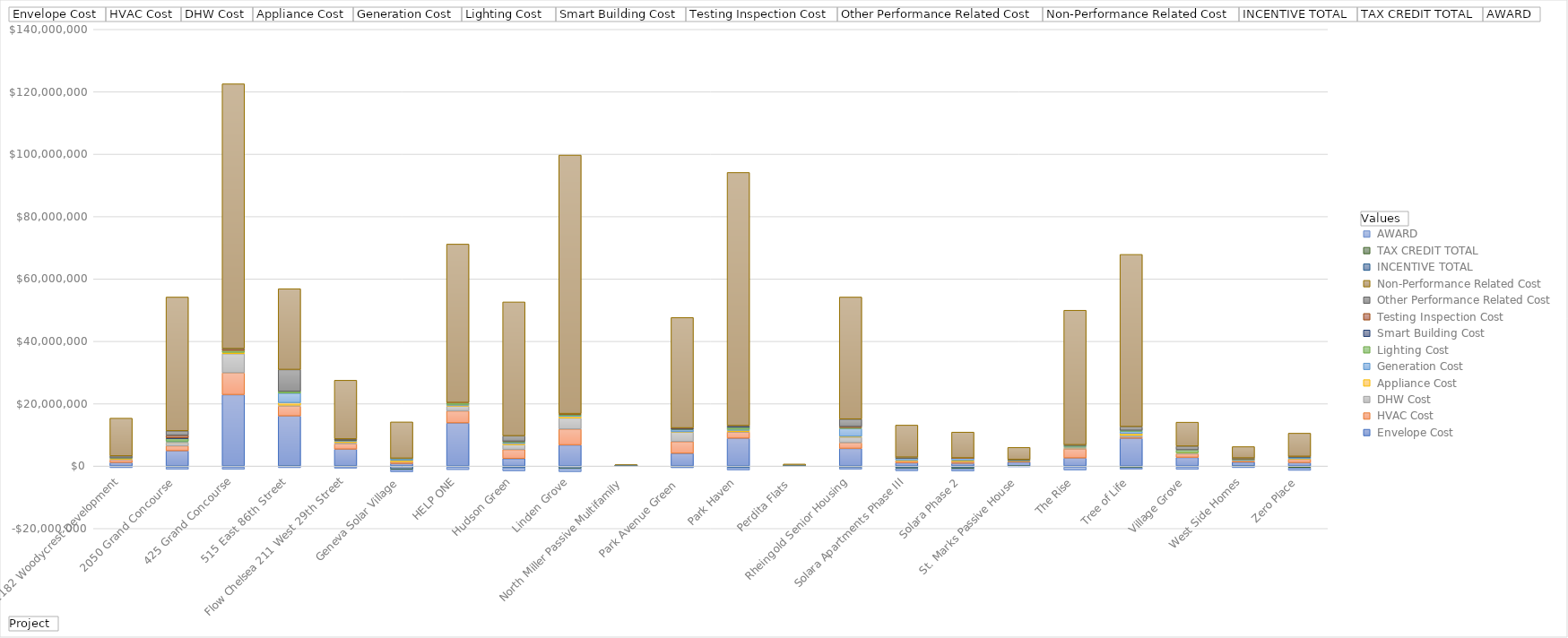
| Category |  Envelope Cost |  HVAC Cost |  DHW Cost |  Appliance Cost |  Generation Cost |  Lighting Cost  |  Smart Building Cost |  Testing Inspection Cost |  Other Performance Related Cost |  Non-Performance Related Cost |  INCENTIVE TOTAL |  TAX CREDIT TOTAL |  AWARD |
|---|---|---|---|---|---|---|---|---|---|---|---|---|---|
| 1182 Woodycrest Development | 1130801.59 | 879051 | 240000 | 140736 | 0 | 200000 | 0 | 0 | 645948 | 12128463.81 | -169700 | 0 | -350931 |
| 2050 Grand Concourse  | 4894107.228 | 1592848.164 | 1059435.67 | 183414 | 239102.25 | 807248.033 | 270000 | 789125 | 1454119.25 | 42899731.587 | -235624 | -55599 | -750000 |
| 425 Grand Concourse | 22898351.84 | 6998906 | 6106206 | 434701 | 0 | 617156 | 0 | 546700 | 50300 | 84887679.16 | -300000 | 0 | -750000 |
| 515 East 86th Street  | 16052777 | 3168000 | 307000 | 788116 | 3072683 | 553272 | 0 | 0 | 7001039.706 | 25917381.706 | -99617.8 | 0 | -425000 |
| Flow Chelsea 211 West 29th Street | 5414207.77 | 1755748.5 | 356582 | 462963.94 | 157000 | 246715.67 | 50000 | 53050 | 198249.76 | 18820784.21 | -145660 | -49394 | -500000 |
| Geneva Solar Village | 823994 | 520783 | 73950 | 410325 | 571158 | 41511 | 0 | 0 | 64637.931 | 11648847 | -978000 | -140885 | -727236 |
| HELP ONE | 13820490 | 3860000 | 1521600 | 291269 | 263398 | 468693 | 0 | 142906 | 0 | 50797762.19 | -300000 | 0 | -850000 |
| Hudson Green | 2407694.931 | 2900092.81 | 1545000 | 374147 | 411400 | 281632.424 | 0 | 37000 | 1742800 | 42929555.668 | -555000 | 0 | -1000000 |
| Linden Grove | 6779865.441 | 5074592.04 | 3559889.291 | 572717.547 | 232500 | 400000 | 0 | 189900 | 0 | 82895592.98 | -700000 | -100000 | -1000000 |
| North Miller Passive Multifamily | 96977.91 | 8539.65 | 5400 | 7000 | 27815 | 2147.13 | 2300 | 7650 | 5000 | 289777.66 | -12600 | -14255 | -39467 |
| Park Avenue Green  | 4079691.16 | 3770484.94 | 3048214.42 | 63526 | 682830 | 141119.7 | 365000 | 73675 | 0 | 35399236.42 | -270600 | -20400 | -250000 |
| Park Haven | 8918168 | 2028100 | 91500 | 404336 | 339261 | 639515.63 | 403739.06 | 45775 | 100000 | 81164882.15 | -508200 | 0 | -750000 |
| Perdita Flats  | 64925.8 | 30000 | 12400 | 21000 | 34600 | 750 | 0 | 0 | 0 | 500484.2 | -6400 | -14933 | -59976 |
| Rheingold Senior Housing | 5651719.02 | 1830400 | 1791250 | 239216.96 | 2535918.75 | 294500 | 0 | 310000 | 2405000 | 39136690.99 | -339240 | -52250 | -637500 |
| Solara Apartments Phase III | 1057815 | 575523 | 60000 | 233256 | 678000 | 51000 | 45000 | 22372 | 131321 | 10287092 | -558250 | -199800 | -750000 |
| Solara Phase 2 | 884237 | 575523 | 60000 | 299400 | 678000 | 51000 | 45000 | 20826 | 0 | 8280460 | -571050 | -283035 | -750000 |
| St. Marks Passive House | 1286500 | 275000 | 105000 | 120000 | 40000 | 80000 | 0 | 0 | 186730 | 3887850 | -13608 | -29906 | -203082 |
| The Rise | 2579052 | 2922400 | 300000 | 212800 | 273845 | 280000 | 0 | 0 | 260966 | 43128939.45 | -279680 | 0 | -1000000 |
| Tree of Life | 8908493.25 | 366127.83 | 575000 | 625000 | 679194.51 | 300000 | 0 | 0 | 1195947.3 | 55205071.24 | -320000 | -185526 | -500000 |
| Village Grove | 2770500 | 1174200 | 320280 | 30642.95 | 0 | 888684 | 0 | 0 | 1189475 | 7697481.89 | -274000 | 0 | -792438 |
| West Side Homes | 1283405.21 | 415414.84 | 213378.98 | 32298.56 | 119136.74 | 301510.08 | 0 | 500 | 224844.694 | 3646134.94 | -115819 | -27878 | -362620 |
| Zero Place | 1101500 | 1100000 | 50000 | 110630 | 475000 | 10000 | 215000 | 45000 | 0 | 7440183 | -315040 | -313400 | -750000 |